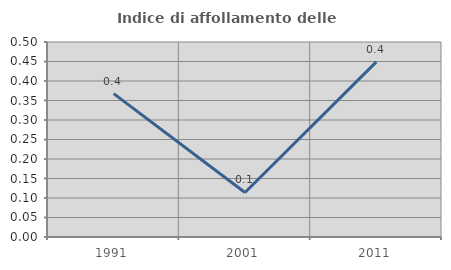
| Category | Indice di affollamento delle abitazioni  |
|---|---|
| 1991.0 | 0.368 |
| 2001.0 | 0.114 |
| 2011.0 | 0.449 |